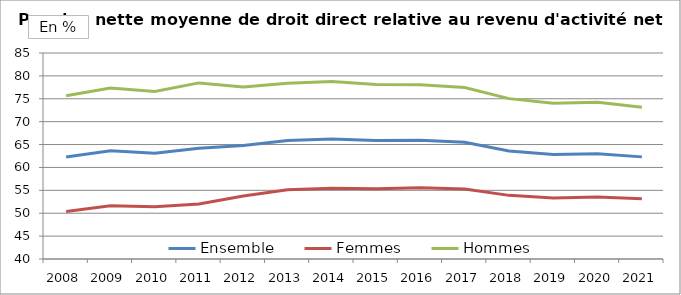
| Category | Ensemble | Femmes | Hommes |
|---|---|---|---|
| 2008.0 | 62.28 | 50.38 | 75.66 |
| 2009.0 | 63.65 | 51.61 | 77.36 |
| 2010.0 | 63.11 | 51.41 | 76.58 |
| 2011.0 | 64.19 | 52 | 78.47 |
| 2012.0 | 64.79 | 53.76 | 77.56 |
| 2013.0 | 65.89 | 55.12 | 78.41 |
| 2014.0 | 66.24 | 55.47 | 78.76 |
| 2015.0 | 65.87 | 55.32 | 78.14 |
| 2016.0 | 65.92 | 55.55 | 78.05 |
| 2017.0 | 65.51 | 55.29 | 77.47 |
| 2018.0 | 63.61 | 53.9 | 75.03 |
| 2019.0 | 62.81 | 53.3 | 74.04 |
| 2020.0 | 63.011 | 53.558 | 74.248 |
| 2021.0 | 62.309 | 53.181 | 73.17 |